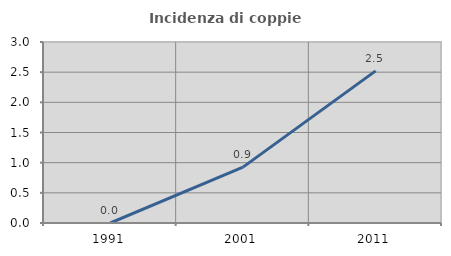
| Category | Incidenza di coppie miste |
|---|---|
| 1991.0 | 0 |
| 2001.0 | 0.926 |
| 2011.0 | 2.521 |